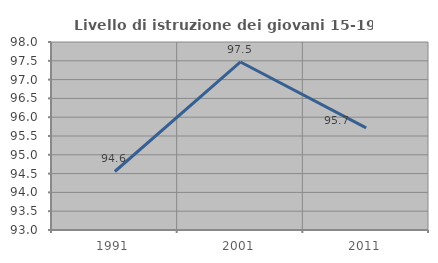
| Category | Livello di istruzione dei giovani 15-19 anni |
|---|---|
| 1991.0 | 94.556 |
| 2001.0 | 97.468 |
| 2011.0 | 95.714 |